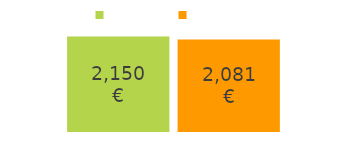
| Category | tulot | menot |
|---|---|---|
| saatavat tulot: | 2150 | 2081 |